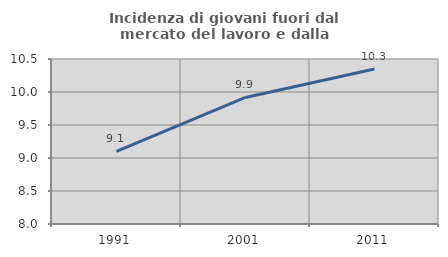
| Category | Incidenza di giovani fuori dal mercato del lavoro e dalla formazione  |
|---|---|
| 1991.0 | 9.1 |
| 2001.0 | 9.917 |
| 2011.0 | 10.349 |